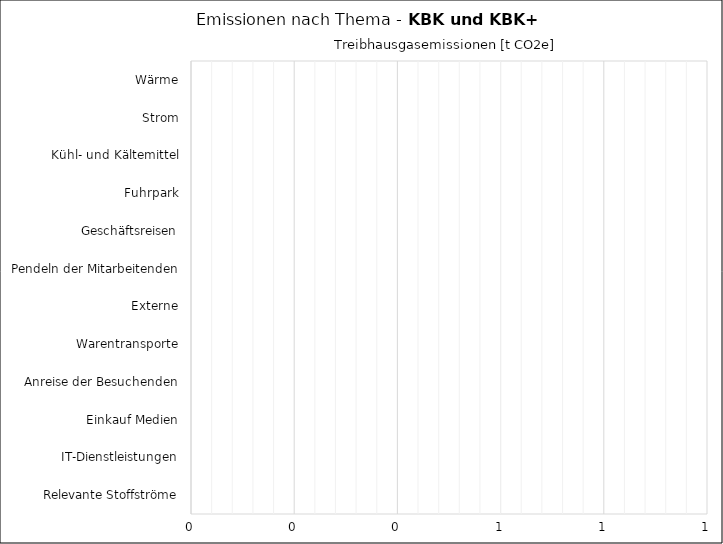
| Category | Series 0 |
|---|---|
| Wärme | 0 |
| Strom | 0 |
| Kühl- und Kältemittel | 0 |
| Fuhrpark | 0 |
| Geschäftsreisen | 0 |
| Pendeln der Mitarbeitenden | 0 |
| Externe | 0 |
| Warentransporte | 0 |
| Anreise der Besuchenden | 0 |
| Einkauf Medien | 0 |
| IT-Dienstleistungen | 0 |
| Relevante Stoffströme | 0 |